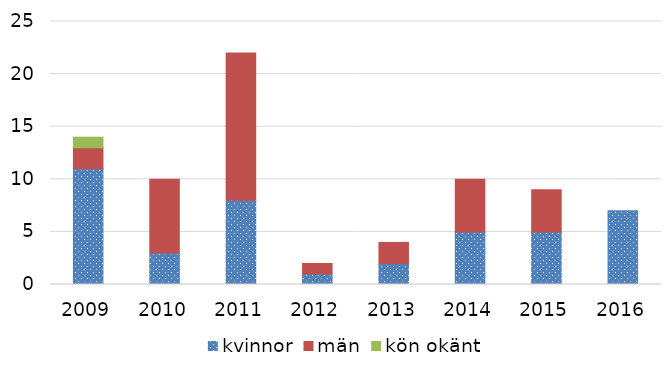
| Category | kvinnor | män | kön okänt |
|---|---|---|---|
| 2009 | 11 | 2 | 1 |
| 2010 | 3 | 7 | 0 |
| 2011 | 8 | 14 | 0 |
| 2012 | 1 | 1 | 0 |
| 2013 | 2 | 2 | 0 |
| 2014 | 5 | 5 | 0 |
| 2015 | 5 | 4 | 0 |
| 2016 | 7 | 0 | 0 |